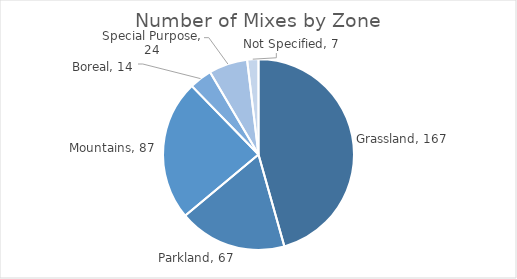
| Category | Series 1 |
|---|---|
| Grassland | 167 |
| Parkland | 67 |
| Mountains | 87 |
| Boreal | 14 |
| Special Purpose | 24 |
| Not Specified | 7 |